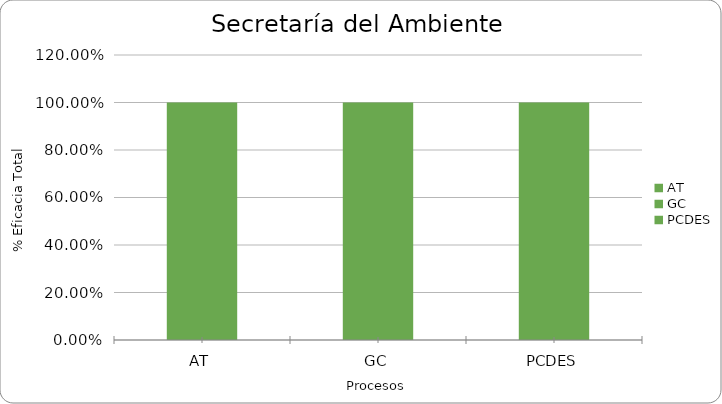
| Category | % Eficacia total |
|---|---|
| AT | 1 |
| GC | 1 |
| PCDES | 1 |